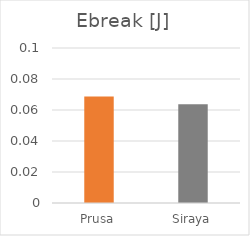
| Category | Ebreak [J] |
|---|---|
| Prusa | 0.069 |
| Siraya | 0.064 |